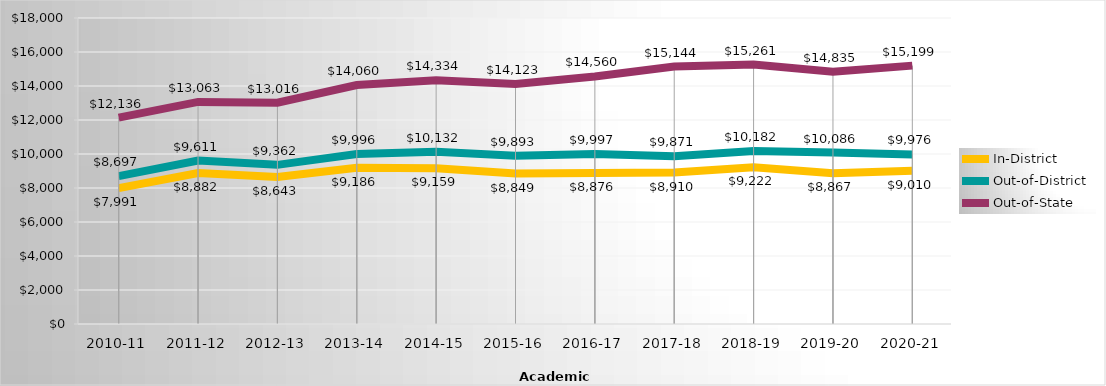
| Category | In-District | Out-of-District | Out-of-State |
|---|---|---|---|
| 2010-11 | 7991 | 8697 | 12136 |
| 2011-12 | 8882 | 9611 | 13063 |
| 2012-13 | 8643.15 | 9362 | 13016 |
| 2013-14 | 9185.83 | 9996.06 | 14060.13 |
| 2014-15 | 9159.04 | 10132.13 | 14333.65 |
| 2015-16 | 8849 | 9893 | 14123 |
| 2016-17 | 8876 | 9997 | 14560 |
| 2017-18 | 8910 | 9871 | 15144 |
| 2018-19 | 9222 | 10182 | 15261 |
| 2019-20 | 8867 | 10086 | 14835 |
| 2020-21 | 9010 | 9976 | 15199 |